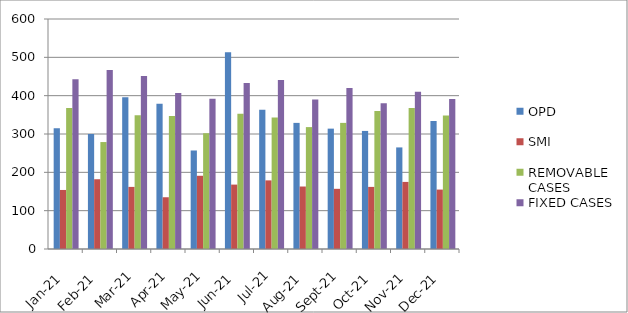
| Category | OPD | SMI | REMOVABLE CASES | FIXED CASES |
|---|---|---|---|---|
| 2021-01-01 | 315 | 154 | 368 | 443 |
| 2021-02-01 | 300 | 182 | 279 | 467 |
| 2021-03-01 | 396 | 162 | 349 | 451 |
| 2021-04-01 | 379 | 135 | 347 | 407 |
| 2021-05-01 | 257 | 191 | 302 | 392 |
| 2021-06-01 | 513 | 168 | 353 | 433 |
| 2021-07-01 | 363 | 179 | 343 | 441 |
| 2021-08-01 | 329 | 163 | 318 | 390 |
| 2021-09-01 | 314 | 157 | 329 | 420 |
| 2021-10-01 | 308 | 162 | 360 | 380 |
| 2021-11-01 | 265 | 175 | 368 | 410 |
| 2021-12-01 | 334 | 155 | 348 | 391 |